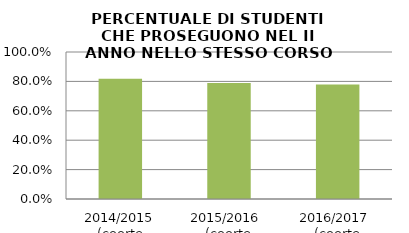
| Category | 2014/2015 (coorte 2013/14) 2015/2016  (coorte 2014/15) 2016/2017  (coorte 2015/16) |
|---|---|
| 2014/2015 (coorte 2013/14) | 0.818 |
| 2015/2016  (coorte 2014/15) | 0.789 |
| 2016/2017  (coorte 2015/16) | 0.779 |